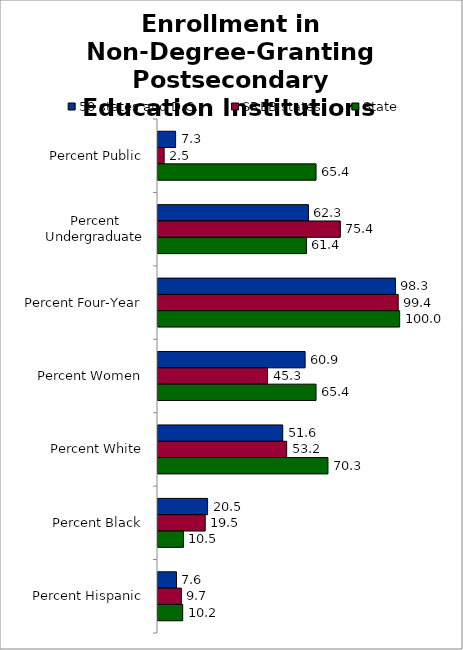
| Category | 50 states and D.C. | SREB states | State |
|---|---|---|---|
| Percent Public | 7.28 | 2.538 | 65.395 |
| Percent Undergraduate | 62.257 | 75.436 | 61.434 |
| Percent Four-Year | 98.263 | 99.387 | 100 |
| Percent Women | 60.874 | 45.33 | 65.395 |
| Percent White | 51.609 | 53.246 | 70.325 |
| Percent Black | 20.52 | 19.532 | 10.542 |
| Percent Hispanic | 7.637 | 9.653 | 10.219 |